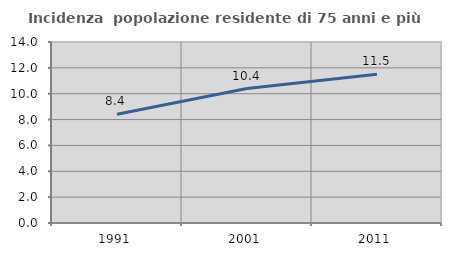
| Category | Incidenza  popolazione residente di 75 anni e più |
|---|---|
| 1991.0 | 8.408 |
| 2001.0 | 10.402 |
| 2011.0 | 11.505 |